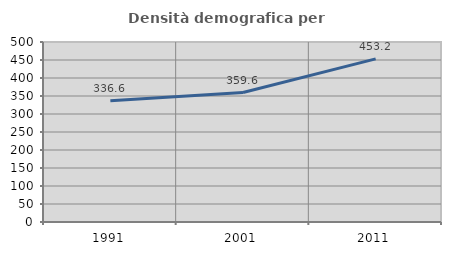
| Category | Densità demografica |
|---|---|
| 1991.0 | 336.558 |
| 2001.0 | 359.61 |
| 2011.0 | 453.215 |